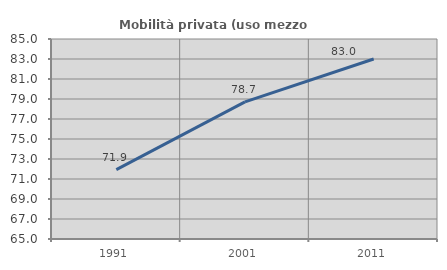
| Category | Mobilità privata (uso mezzo privato) |
|---|---|
| 1991.0 | 71.945 |
| 2001.0 | 78.717 |
| 2011.0 | 83.003 |